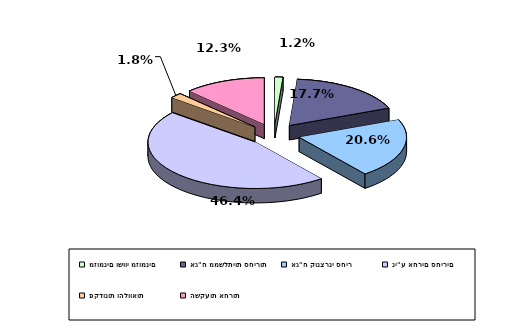
| Category | Series 0 |
|---|---|
| מזומנים ושווי מזומנים | 0.012 |
| אג"ח ממשלתיות סחירות | 0.177 |
| אג"ח קונצרני סחיר | 0.206 |
| ני"ע אחרים סחירים | 0.464 |
| פקדונות והלוואות | 0.018 |
| השקעות אחרות | 0.123 |